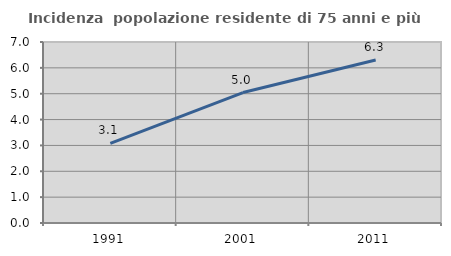
| Category | Incidenza  popolazione residente di 75 anni e più |
|---|---|
| 1991.0 | 3.081 |
| 2001.0 | 5.044 |
| 2011.0 | 6.303 |